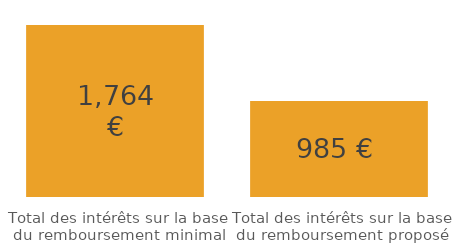
| Category | Series 0 |
|---|---|
| Total des intérêts sur la base du remboursement minimal | 1763.952 |
| Total des intérêts sur la base du remboursement proposé | 984.811 |